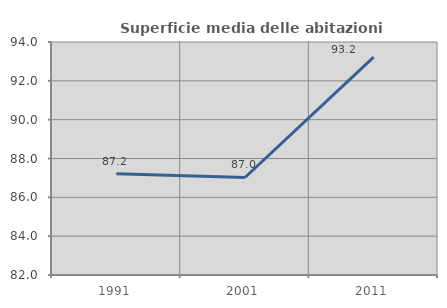
| Category | Superficie media delle abitazioni occupate |
|---|---|
| 1991.0 | 87.212 |
| 2001.0 | 87.023 |
| 2011.0 | 93.218 |